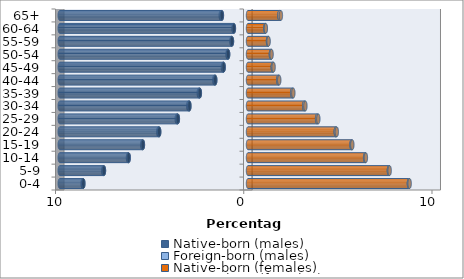
| Category | Native-born (males) | Foreign-born (males) | Native-born (females) | Foreign-born (females) |
|---|---|---|---|---|
| 0-4 | -8.748 | -0.038 | 8.548 | 0.038 |
| 5-9 | -7.653 | -0.038 | 7.485 | 0.04 |
| 10-14 | -6.339 | -0.037 | 6.222 | 0.04 |
| 15-19 | -5.584 | -0.037 | 5.5 | 0.041 |
| 20-24 | -4.718 | -0.048 | 4.662 | 0.055 |
| 25-29 | -3.726 | -0.059 | 3.67 | 0.065 |
| 30-34 | -3.114 | -0.062 | 2.985 | 0.064 |
| 35-39 | -2.558 | -0.057 | 2.35 | 0.057 |
| 40-44 | -1.74 | -0.049 | 1.61 | 0.05 |
| 45-49 | -1.293 | -0.039 | 1.317 | 0.043 |
| 50-54 | -1.056 | -0.031 | 1.216 | 0.036 |
| 55-59 | -0.853 | -0.026 | 1.063 | 0.031 |
| 60-64 | -0.75 | -0.018 | 0.923 | 0.023 |
| 65+ | -1.387 | -0.061 | 1.667 | 0.08 |